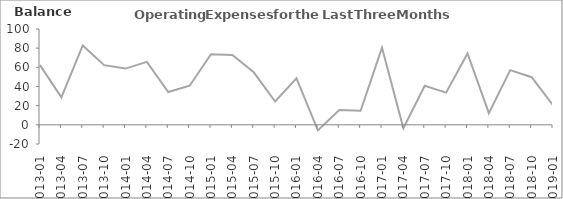
| Category | Balance |
|---|---|
| 2013-01 | 62.3 |
| 2013-04 | 28.6 |
| 2013-07 | 82.8 |
| 2013-10 | 62.3 |
| 2014-01 | 58.7 |
| 2014-04 | 65.7 |
| 2014-07 | 34.2 |
| 2014-10 | 40.8 |
| 2015-01 | 73.7 |
| 2015-04 | 72.9 |
| 2015-07 | 54.8 |
| 2015-10 | 24.3 |
| 2016-01 | 48.5 |
| 2016-04 | -5.8 |
| 2016-07 | 15.4 |
| 2016-10 | 14.6 |
| 2017-01 | 80.4 |
| 2017-04 | -3.6 |
| 2017-07 | 40.8 |
| 2017-10 | 33.6 |
| 2018-01 | 74.5 |
| 2018-04 | 12.2 |
| 2018-07 | 57.1 |
| 2018-10 | 49.7 |
| 2019-01 | 20.5 |